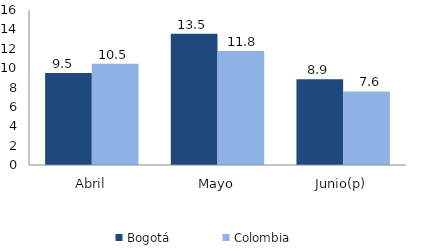
| Category | Bogotá | Colombia |
|---|---|---|
| Abril | 9.485 | 10.453 |
| Mayo | 13.541 | 11.781 |
| Junio(p) | 8.86 | 7.591 |